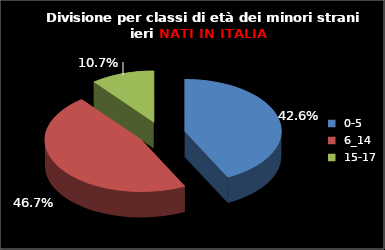
| Category | Series 0 | Series 1 |
|---|---|---|
| 0-5 | 104 |  |
| 6_14 | 114 |  |
| 15-17 | 26 |  |